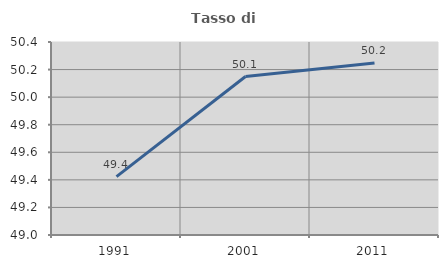
| Category | Tasso di occupazione   |
|---|---|
| 1991.0 | 49.424 |
| 2001.0 | 50.149 |
| 2011.0 | 50.248 |